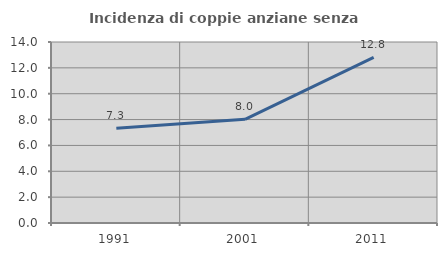
| Category | Incidenza di coppie anziane senza figli  |
|---|---|
| 1991.0 | 7.335 |
| 2001.0 | 8.02 |
| 2011.0 | 12.818 |